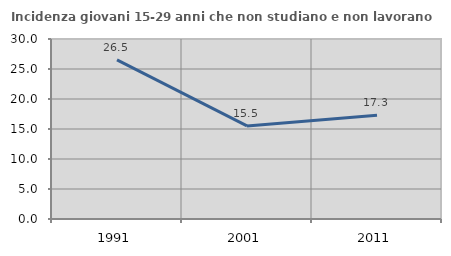
| Category | Incidenza giovani 15-29 anni che non studiano e non lavorano  |
|---|---|
| 1991.0 | 26.516 |
| 2001.0 | 15.515 |
| 2011.0 | 17.276 |